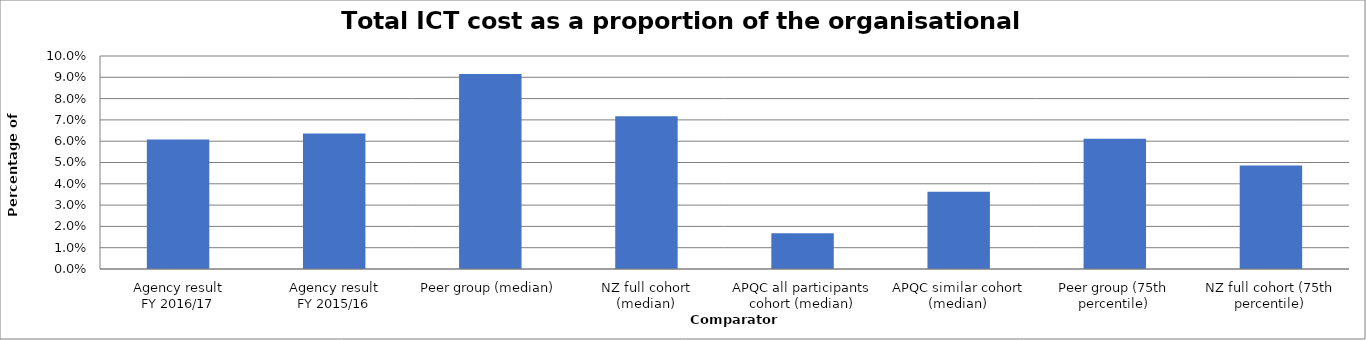
| Category | Result |
|---|---|
| Agency result
FY 2016/17 | 0.061 |
| Agency result
FY 2015/16 | 0.064 |
| Peer group (median) | 0.092 |
| NZ full cohort (median) | 0.072 |
| APQC all participants cohort (median) | 0.017 |
| APQC similar cohort (median) | 0.036 |
| Peer group (75th percentile) | 0.061 |
| NZ full cohort (75th percentile) | 0.049 |